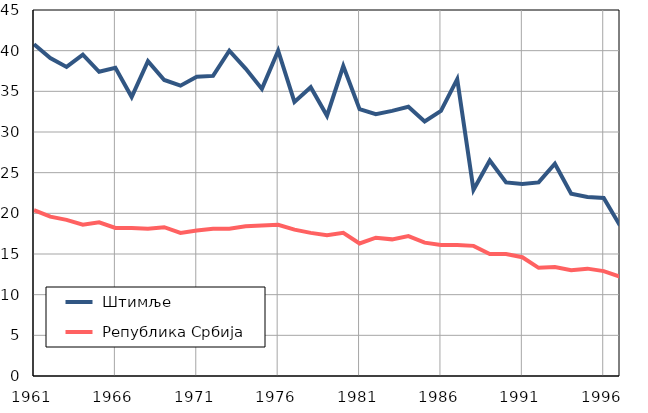
| Category |  Штимље |  Република Србија |
|---|---|---|
| 1961.0 | 40.8 | 20.4 |
| 1962.0 | 39.1 | 19.6 |
| 1963.0 | 38 | 19.2 |
| 1964.0 | 39.5 | 18.6 |
| 1965.0 | 37.4 | 18.9 |
| 1966.0 | 37.9 | 18.2 |
| 1967.0 | 34.3 | 18.2 |
| 1968.0 | 38.7 | 18.1 |
| 1969.0 | 36.4 | 18.3 |
| 1970.0 | 35.7 | 17.6 |
| 1971.0 | 36.8 | 17.9 |
| 1972.0 | 36.9 | 18.1 |
| 1973.0 | 40 | 18.1 |
| 1974.0 | 37.8 | 18.4 |
| 1975.0 | 35.3 | 18.5 |
| 1976.0 | 40 | 18.6 |
| 1977.0 | 33.7 | 18 |
| 1978.0 | 35.5 | 17.6 |
| 1979.0 | 32 | 17.3 |
| 1980.0 | 38.1 | 17.6 |
| 1981.0 | 32.8 | 16.3 |
| 1982.0 | 32.2 | 17 |
| 1983.0 | 32.6 | 16.8 |
| 1984.0 | 33.1 | 17.2 |
| 1985.0 | 31.3 | 16.4 |
| 1986.0 | 32.6 | 16.1 |
| 1987.0 | 36.5 | 16.1 |
| 1988.0 | 22.9 | 16 |
| 1989.0 | 26.5 | 15 |
| 1990.0 | 23.8 | 15 |
| 1991.0 | 23.6 | 14.6 |
| 1992.0 | 23.8 | 13.3 |
| 1993.0 | 26.1 | 13.4 |
| 1994.0 | 22.4 | 13 |
| 1995.0 | 22 | 13.2 |
| 1996.0 | 21.9 | 12.9 |
| 1997.0 | 18.5 | 12.2 |